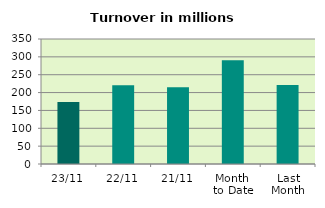
| Category | Series 0 |
|---|---|
| 23/11 | 173.522 |
| 22/11 | 220.673 |
| 21/11 | 215.143 |
| Month 
to Date | 290.598 |
| Last
Month | 221.516 |